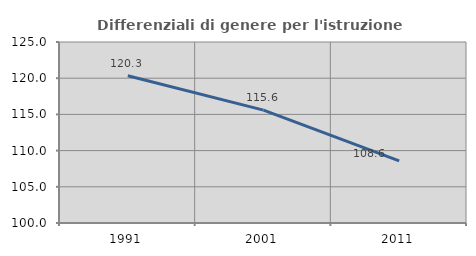
| Category | Differenziali di genere per l'istruzione superiore |
|---|---|
| 1991.0 | 120.343 |
| 2001.0 | 115.592 |
| 2011.0 | 108.594 |